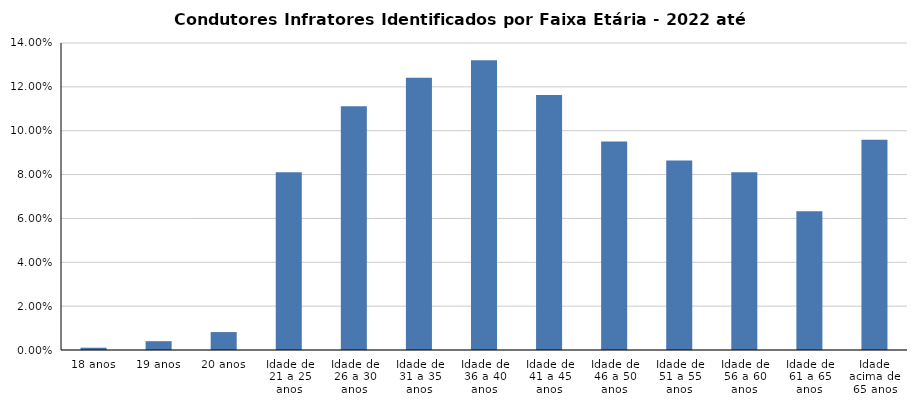
| Category | 2022 |
|---|---|
| 18 anos | 0.001 |
| 19 anos | 0.004 |
| 20 anos | 0.008 |
| Idade de 21 a 25 anos | 0.081 |
| Idade de 26 a 30 anos | 0.111 |
| Idade de 31 a 35 anos | 0.124 |
| Idade de 36 a 40 anos | 0.132 |
| Idade de 41 a 45 anos | 0.116 |
| Idade de 46 a 50 anos | 0.095 |
| Idade de 51 a 55 anos | 0.086 |
| Idade de 56 a 60 anos | 0.081 |
| Idade de 61 a 65 anos | 0.063 |
| Idade acima de 65 anos | 0.096 |